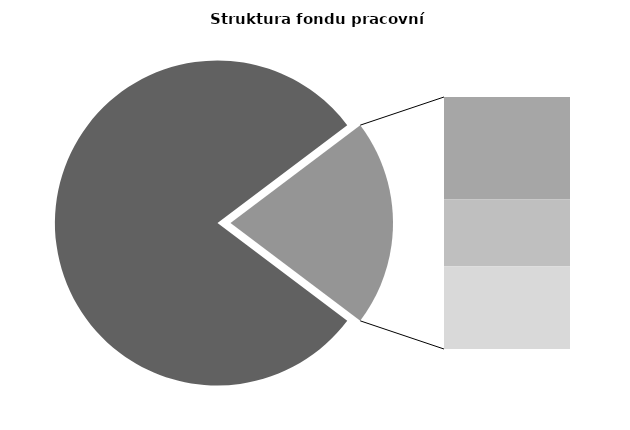
| Category | Series 0 |
|---|---|
| Průměrná měsíční odpracovaná doba bez přesčasu | 135.505 |
| Dovolená | 14.238 |
| Nemoc | 9.318 |
| Jiné | 11.533 |